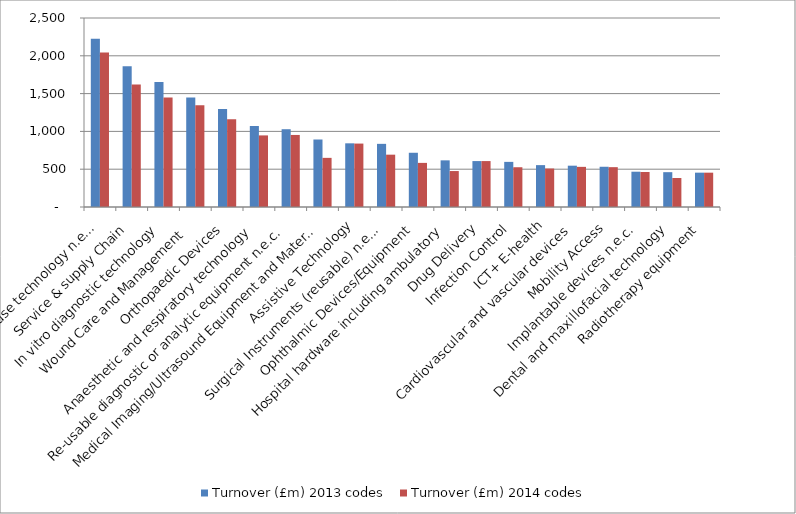
| Category | Turnover (£m) 2013 codes | Turnover (£m) 2014 codes |
|---|---|---|
| Single use technology n.e.c. | 2226.495 | 2044 |
| Service & supply Chain | 1860.713 | 1621 |
| In vitro diagnostic technology | 1653.881 | 1450 |
| Wound Care and Management  | 1447 | 1346 |
| Orthopaedic Devices | 1297.512 | 1160 |
| Anaesthetic and respiratory technology | 1071.171 | 947 |
| Re-usable diagnostic or analytic equipment n.e.c. | 1028.817 | 953 |
| Medical Imaging/Ultrasound Equipment and Materials | 892.933 | 650 |
| Assistive Technology | 842.31 | 839 |
| Surgical Instruments (reusable) n.e.c. | 835.309 | 692.086 |
| Ophthalmic Devices/Equipment | 717.374 | 583.498 |
| Hospital hardware including ambulatory | 617.046 | 475.662 |
| Drug Delivery | 607.485 | 607.485 |
| Infection Control  | 596.862 | 526 |
| ICT+ E-health | 553.91 | 509 |
| Cardiovascular and vascular devices | 546.513 | 531 |
| Mobility Access | 532.292 | 527 |
| Implantable devices n.e.c. | 466.802 | 463 |
| Dental and maxillofacial technology | 460.738 | 384 |
| Radiotherapy equipment | 454.212 | 454 |